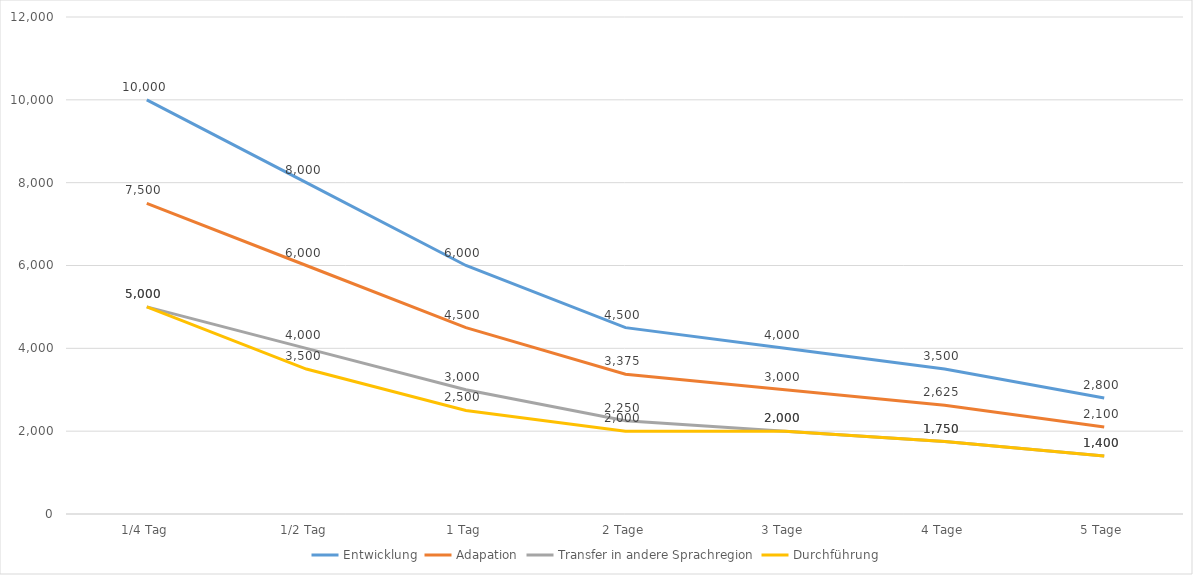
| Category | Entwicklung | Adapation | Transfer in andere Sprachregion | Durchführung |
|---|---|---|---|---|
| 1/4 Tag | 10000 | 7500 | 5000 | 5000 |
| 1/2 Tag | 8000 | 6000 | 4000 | 3500 |
| 1 Tag | 6000 | 4500 | 3000 | 2500 |
| 2 Tage | 4500 | 3375 | 2250 | 2000 |
| 3 Tage | 4000 | 3000 | 2000 | 2000 |
| 4 Tage | 3500 | 2625 | 1750 | 1750 |
| 5 Tage | 2800 | 2100 | 1400 | 1400 |